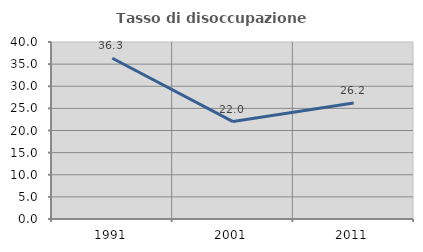
| Category | Tasso di disoccupazione giovanile  |
|---|---|
| 1991.0 | 36.329 |
| 2001.0 | 22.011 |
| 2011.0 | 26.234 |